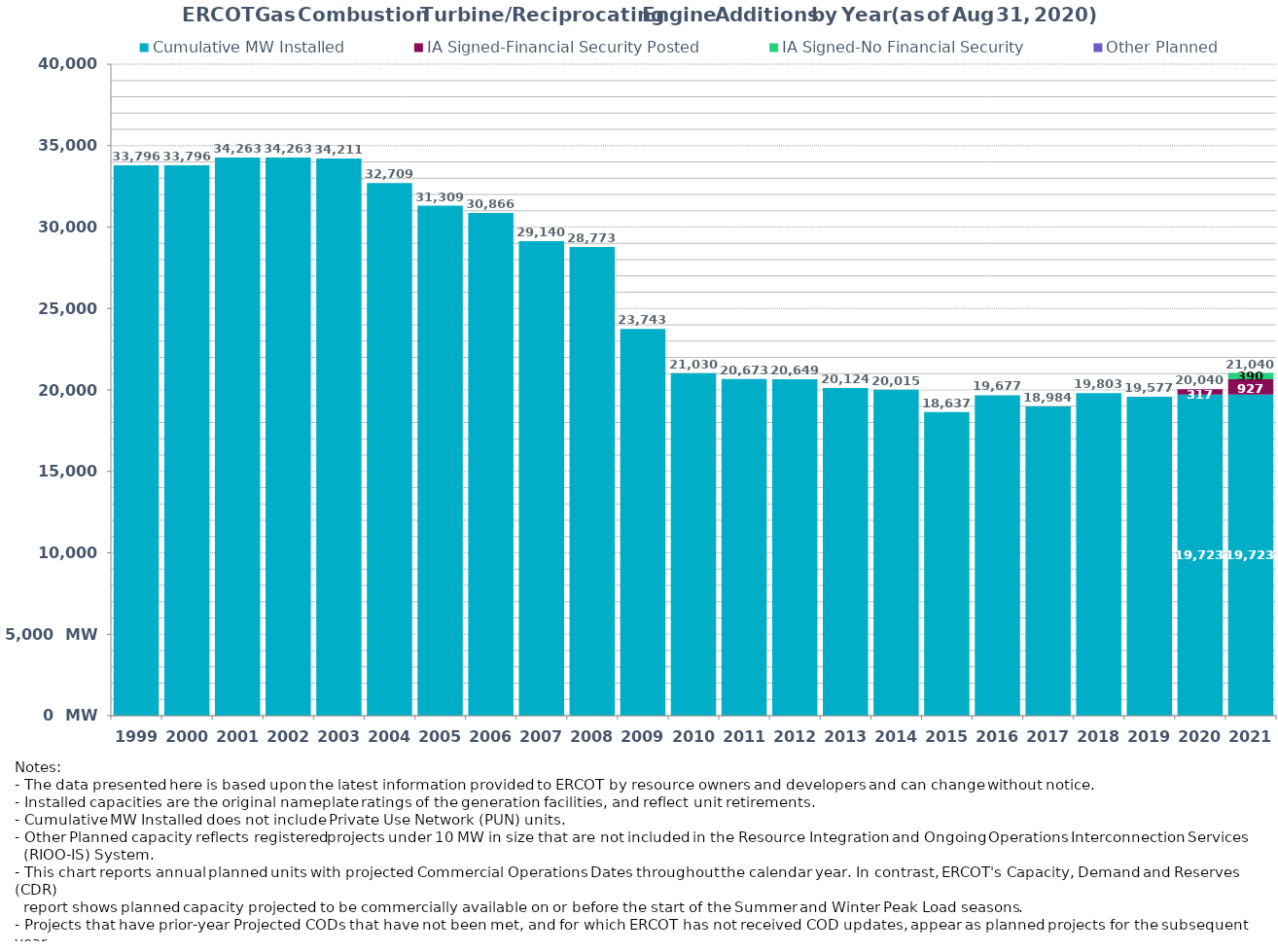
| Category | Cumulative MW Installed | Cumulative MW Synchronized | IA Signed-Financial Security Posted  | IA Signed-No Financial Security  | Other Planned | Cumulative Installed and Planned |
|---|---|---|---|---|---|---|
| 1999.0 | 33796.03 | 0 | 0 | 0 | 0 | 33796.03 |
| 2000.0 | 33796.03 | 0 | 0 | 0 | 0 | 33796.03 |
| 2001.0 | 34262.59 | 0 | 0 | 0 | 0 | 34262.59 |
| 2002.0 | 34262.59 | 0 | 0 | 0 | 0 | 34262.59 |
| 2003.0 | 34210.59 | 0 | 0 | 0 | 0 | 34210.59 |
| 2004.0 | 32708.69 | 0 | 0 | 0 | 0 | 32708.69 |
| 2005.0 | 31309.49 | 0 | 0 | 0 | 0 | 31309.49 |
| 2006.0 | 30866.49 | 0 | 0 | 0 | 0 | 30866.49 |
| 2007.0 | 29140.49 | 0 | 0 | 0 | 0 | 29140.49 |
| 2008.0 | 28773.29 | 0 | 0 | 0 | 0 | 28773.29 |
| 2009.0 | 23743.29 | 0 | 0 | 0 | 0 | 23743.29 |
| 2010.0 | 21030.17 | 0 | 0 | 0 | 0 | 21030.17 |
| 2011.0 | 20673.47 | 0 | 0 | 0 | 0 | 20673.47 |
| 2012.0 | 20649.47 | 0 | 0 | 0 | 0 | 20649.47 |
| 2013.0 | 20124.47 | 0 | 0 | 0 | 0 | 20124.47 |
| 2014.0 | 20015.47 | 0 | 0 | 0 | 0 | 20015.47 |
| 2015.0 | 18636.67 | 0 | 0 | 0 | 0 | 18636.67 |
| 2016.0 | 19677.05 | 0 | 0 | 0 | 0 | 19677.05 |
| 2017.0 | 18984.19 | 0 | 0 | 0 | 0 | 18984.19 |
| 2018.0 | 19803.35 | 0 | 0 | 0 | 0 | 19803.35 |
| 2019.0 | 19577.05 | 0 | 0 | 0 | 0 | 19577.05 |
| 2020.0 | 19723.34 | 0 | 317 | 0 | 0 | 20040.34 |
| 2021.0 | 19723.34 | 0 | 927 | 390 | 0 | 21040.34 |